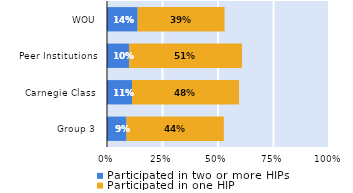
| Category | Participated in two or more HIPs | Participated in one HIP |
|---|---|---|
| Group 3 | 0.088 | 0.438 |
| Carnegie Class | 0.113 | 0.482 |
| Peer Institutions | 0.1 | 0.508 |
| WOU | 0.138 | 0.391 |